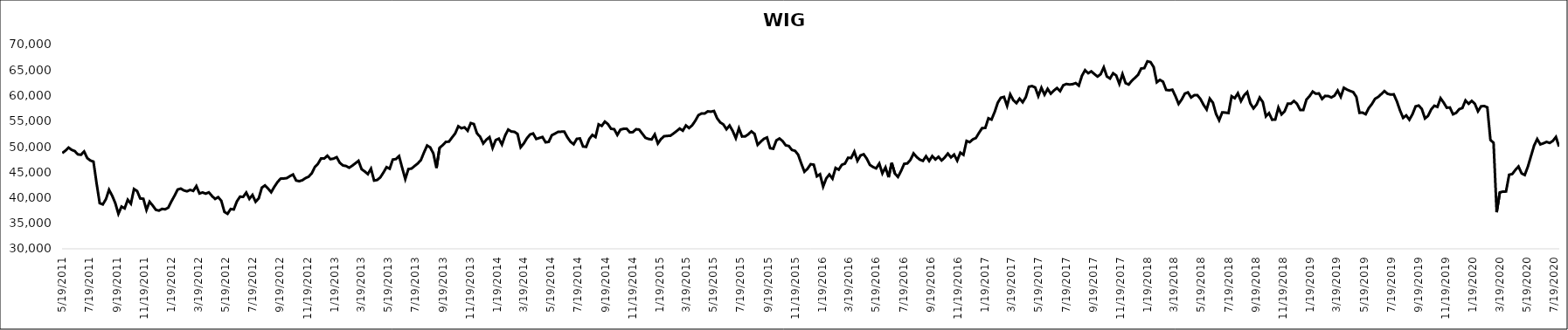
| Category | WIG |
|---|---|
| 5/19/11 | 48747.55 |
| 5/26/11 | 49215.53 |
| 6/2/11 | 49824.93 |
| 6/9/11 | 49378.82 |
| 6/16/11 | 49129.21 |
| 6/23/11 | 48485.26 |
| 6/30/11 | 48414.36 |
| 7/7/11 | 49057.05 |
| 7/14/11 | 47768.38 |
| 7/21/11 | 47291.31 |
| 7/28/11 | 47071.4 |
| 8/4/11 | 42828.22 |
| 8/11/11 | 38934.71 |
| 8/18/11 | 38697.56 |
| 8/25/11 | 39715.27 |
| 9/1/11 | 41553.09 |
| 9/8/11 | 40405.17 |
| 9/15/11 | 38945 |
| 9/22/11 | 36851.2 |
| 9/29/11 | 38264.32 |
| 10/6/11 | 37915.03 |
| 10/13/11 | 39608.13 |
| 10/20/11 | 38835.92 |
| 10/27/11 | 41708.88 |
| 11/3/11 | 41313.92 |
| 11/10/11 | 39853.18 |
| 11/17/11 | 39797.19 |
| 11/24/11 | 37607.27 |
| 12/1/11 | 39215.21 |
| 12/8/11 | 38474.28 |
| 12/15/11 | 37637.47 |
| 12/22/11 | 37478.7 |
| 12/29/11 | 37814.52 |
| 1/5/12 | 37739.39 |
| 1/12/12 | 38062.87 |
| 1/19/12 | 39288.13 |
| 1/26/12 | 40392.48 |
| 2/2/12 | 41602.24 |
| 2/9/12 | 41792.46 |
| 2/16/12 | 41430.3 |
| 2/23/12 | 41258.14 |
| 3/1/12 | 41533.87 |
| 3/8/12 | 41337.97 |
| 3/15/12 | 42281.33 |
| 3/22/12 | 40834.43 |
| 3/29/12 | 41028.06 |
| 4/5/12 | 40802.41 |
| 4/12/12 | 41053.82 |
| 4/19/12 | 40354.53 |
| 4/26/12 | 39761.78 |
| 5/3/12 | 40114.73 |
| 5/10/12 | 39404.16 |
| 5/17/12 | 37228.88 |
| 5/24/12 | 36852.75 |
| 5/31/12 | 37793.58 |
| 6/7/12 | 37707.25 |
| 6/14/12 | 39286.64 |
| 6/21/12 | 40207.61 |
| 6/28/12 | 40165.34 |
| 7/5/12 | 41013.96 |
| 7/12/12 | 39778.1 |
| 7/19/12 | 40545.64 |
| 7/26/12 | 39213.05 |
| 8/2/12 | 39876.95 |
| 8/9/12 | 41976.63 |
| 8/16/12 | 42408.41 |
| 8/23/12 | 41795.63 |
| 8/30/12 | 41077.44 |
| 9/6/12 | 42134.93 |
| 9/13/12 | 43047.41 |
| 9/20/12 | 43737.02 |
| 9/27/12 | 43763.3 |
| 10/4/12 | 43840.23 |
| 10/11/12 | 44224.67 |
| 10/18/12 | 44550.12 |
| 10/25/12 | 43374.6 |
| 11/1/12 | 43232.44 |
| 11/8/12 | 43429.42 |
| 11/15/12 | 43845.94 |
| 11/22/12 | 44121.53 |
| 11/29/12 | 44787.84 |
| 12/6/12 | 46019.97 |
| 12/13/12 | 46653.84 |
| 12/20/12 | 47701.82 |
| 12/27/12 | 47673.03 |
| 1/3/13 | 48222.72 |
| 1/10/13 | 47546.91 |
| 1/17/13 | 47661.37 |
| 1/24/13 | 47942.04 |
| 1/31/13 | 46840.15 |
| 2/7/13 | 46329.66 |
| 2/14/13 | 46211.54 |
| 2/21/13 | 45879.9 |
| 2/28/13 | 46280.36 |
| 3/7/13 | 46745.26 |
| 3/14/13 | 47223.68 |
| 3/21/13 | 45580.47 |
| 3/28/13 | 45147.57 |
| 4/4/13 | 44623.89 |
| 4/11/13 | 45688.48 |
| 4/18/13 | 43364.7 |
| 4/25/13 | 43482.18 |
| 5/2/13 | 43991.51 |
| 5/9/13 | 44943.16 |
| 5/16/13 | 45992.03 |
| 5/23/13 | 45687.76 |
| 5/30/13 | 47476.64 |
| 6/6/13 | 47573.66 |
| 6/13/13 | 48152.82 |
| 6/20/13 | 45870 |
| 6/27/13 | 43667.37 |
| 7/4/13 | 45613.75 |
| 7/11/13 | 45712.72 |
| 7/18/13 | 46221.23 |
| 7/25/13 | 46713.02 |
| 8/1/13 | 47370.81 |
| 8/8/13 | 48862.88 |
| 8/15/13 | 50223.95 |
| 8/22/13 | 49846.48 |
| 8/29/13 | 48676.45 |
| 9/5/13 | 45830.66 |
| 9/12/13 | 49771.55 |
| 9/19/13 | 50300.53 |
| 9/26/13 | 50936.34 |
| 10/3/13 | 50982.03 |
| 10/10/13 | 51806.83 |
| 10/17/13 | 52573.59 |
| 10/24/13 | 53994.46 |
| 10/31/13 | 53607.86 |
| 11/7/13 | 53785.07 |
| 11/14/13 | 53127.16 |
| 11/21/13 | 54621.21 |
| 11/28/13 | 54420.19 |
| 12/5/13 | 52597.13 |
| 12/12/13 | 51947.96 |
| 12/19/13 | 50631.75 |
| 12/26/13 | 51362.3 |
| 1/2/14 | 51865.89 |
| 1/9/14 | 49753.03 |
| 1/16/14 | 51288.7 |
| 1/23/14 | 51569.21 |
| 1/30/14 | 50417.17 |
| 2/6/14 | 52138.87 |
| 2/13/14 | 53349.65 |
| 2/20/14 | 52967.02 |
| 2/27/14 | 52906.04 |
| 3/6/14 | 52487.84 |
| 3/13/14 | 49878.65 |
| 3/20/14 | 50627.71 |
| 3/27/14 | 51642.99 |
| 4/3/14 | 52376.18 |
| 4/10/14 | 52580.73 |
| 4/17/14 | 51510.98 |
| 4/24/14 | 51705.76 |
| 5/1/14 | 51892.77 |
| 5/8/14 | 50851.25 |
| 5/15/14 | 50944.5 |
| 5/22/14 | 52244.13 |
| 5/29/14 | 52553.48 |
| 6/5/14 | 52901.29 |
| 6/12/14 | 52927.91 |
| 6/19/14 | 52937.45 |
| 6/26/14 | 51815.43 |
| 7/3/14 | 50951.73 |
| 7/10/14 | 50474.36 |
| 7/17/14 | 51527.37 |
| 7/24/14 | 51613.47 |
| 7/31/14 | 50037.12 |
| 8/7/14 | 49958.67 |
| 8/14/14 | 51512.57 |
| 8/21/14 | 52294.93 |
| 8/28/14 | 51882.01 |
| 9/4/14 | 54358.49 |
| 9/11/14 | 54065.27 |
| 9/18/14 | 54906.1 |
| 9/25/14 | 54411.77 |
| 10/2/14 | 53498.77 |
| 10/9/14 | 53416.03 |
| 10/16/14 | 52297.79 |
| 10/23/14 | 53335.43 |
| 10/30/14 | 53492 |
| 11/6/14 | 53512.14 |
| 11/13/14 | 52816.35 |
| 11/20/14 | 52848.54 |
| 11/27/14 | 53415.63 |
| 12/4/14 | 53346.86 |
| 12/11/14 | 52550.03 |
| 12/18/14 | 51739.04 |
| 12/25/14 | 51511.68 |
| 1/1/15 | 51416.08 |
| 1/8/15 | 52391 |
| 1/15/15 | 50616.63 |
| 1/22/15 | 51484.81 |
| 1/29/15 | 52040.24 |
| 2/5/15 | 52107.26 |
| 2/12/15 | 52139.81 |
| 2/19/15 | 52572.95 |
| 2/26/15 | 53042.6 |
| 3/5/15 | 53546.4 |
| 3/12/15 | 53136.13 |
| 3/19/15 | 54148.48 |
| 3/26/15 | 53649.9 |
| 4/2/15 | 54179.04 |
| 4/9/15 | 55063.85 |
| 4/16/15 | 56165.1 |
| 4/23/15 | 56492.95 |
| 4/30/15 | 56477.69 |
| 5/7/15 | 56911.34 |
| 5/14/15 | 56845.83 |
| 5/21/15 | 56990.6 |
| 5/28/15 | 55556.13 |
| 6/4/15 | 54749.74 |
| 6/11/15 | 54357.69 |
| 6/18/15 | 53408.53 |
| 6/25/15 | 54141.2 |
| 7/2/15 | 53074.71 |
| 7/9/15 | 51658.71 |
| 7/16/15 | 53588.24 |
| 7/23/15 | 51986.22 |
| 7/30/15 | 52011.81 |
| 8/6/15 | 52418.07 |
| 8/13/15 | 52995.96 |
| 8/20/15 | 52508.32 |
| 8/27/15 | 50366.09 |
| 9/3/15 | 50977.06 |
| 9/10/15 | 51527.08 |
| 9/17/15 | 51801.58 |
| 9/24/15 | 49701.31 |
| 10/1/15 | 49593.95 |
| 10/8/15 | 51222.77 |
| 10/15/15 | 51599.62 |
| 10/22/15 | 51094.29 |
| 10/29/15 | 50262.68 |
| 11/5/15 | 50125.85 |
| 11/12/15 | 49358.2 |
| 11/19/15 | 49177.74 |
| 11/26/15 | 48418.14 |
| 12/3/15 | 46693.09 |
| 12/10/15 | 45093.65 |
| 12/17/15 | 45684.05 |
| 12/24/15 | 46564.08 |
| 12/31/15 | 46467.38 |
| 1/7/16 | 44195.91 |
| 1/14/16 | 44596.08 |
| 1/21/16 | 42180.3 |
| 1/28/16 | 43778.96 |
| 2/4/16 | 44557.64 |
| 2/11/16 | 43741.96 |
| 2/18/16 | 45834.88 |
| 2/25/16 | 45497.77 |
| 3/3/16 | 46448.27 |
| 3/10/16 | 46686.74 |
| 3/17/16 | 47833.39 |
| 3/24/16 | 47778.01 |
| 3/31/16 | 49017.35 |
| 4/7/16 | 47231.36 |
| 4/14/16 | 48285.21 |
| 4/21/16 | 48514.39 |
| 4/28/16 | 47643.7 |
| 5/5/16 | 46430.16 |
| 5/12/16 | 46022.02 |
| 5/19/16 | 45751.68 |
| 5/26/16 | 46695.37 |
| 6/2/16 | 44772.72 |
| 6/9/16 | 45940.12 |
| 6/16/16 | 44007.81 |
| 6/23/16 | 46826.85 |
| 6/30/16 | 44748.53 |
| 7/7/16 | 44077.16 |
| 7/14/16 | 45246.26 |
| 7/21/16 | 46639.17 |
| 7/28/16 | 46718.98 |
| 8/4/16 | 47407.09 |
| 8/11/16 | 48675.96 |
| 8/18/16 | 47967.07 |
| 8/25/16 | 47464.07 |
| 9/1/16 | 47221.32 |
| 9/8/16 | 48129.15 |
| 9/15/16 | 47198.39 |
| 9/22/16 | 48154.88 |
| 9/29/16 | 47494.62 |
| 10/6/16 | 48014.44 |
| 10/13/16 | 47303.15 |
| 10/20/16 | 47894.17 |
| 10/27/16 | 48651.28 |
| 11/3/16 | 47899.61 |
| 11/10/16 | 48447.59 |
| 11/17/16 | 47274.21 |
| 11/24/16 | 48824.83 |
| 12/1/16 | 48404.21 |
| 12/8/16 | 51123.43 |
| 12/15/16 | 50881.35 |
| 12/22/16 | 51423.71 |
| 12/29/16 | 51703.91 |
| 1/5/17 | 52721.67 |
| 1/12/17 | 53650.94 |
| 1/19/17 | 53654.99 |
| 1/26/17 | 55560.23 |
| 2/2/17 | 55303.11 |
| 2/9/17 | 56785.52 |
| 2/16/17 | 58610.28 |
| 2/23/17 | 59583.89 |
| 3/2/17 | 59743.64 |
| 3/9/17 | 57986.6 |
| 3/16/17 | 60247.18 |
| 3/23/17 | 59093.68 |
| 3/30/17 | 58527.2 |
| 4/6/17 | 59406.36 |
| 4/13/17 | 58695.36 |
| 4/20/17 | 59700.07 |
| 4/27/17 | 61731.8 |
| 5/4/17 | 61862.8 |
| 5/11/17 | 61598.78 |
| 5/18/17 | 59901.12 |
| 5/25/17 | 61536.22 |
| 6/1/17 | 60181.96 |
| 6/8/17 | 61312.68 |
| 6/15/17 | 60381.07 |
| 6/22/17 | 60987.33 |
| 6/29/17 | 61475.96 |
| 7/6/17 | 60869.83 |
| 7/13/17 | 62018.68 |
| 7/20/17 | 62269.72 |
| 7/27/17 | 62171.7 |
| 8/3/17 | 62231.08 |
| 8/10/17 | 62451.57 |
| 8/17/17 | 61949.4 |
| 8/24/17 | 63886.54 |
| 8/31/17 | 64973.76 |
| 9/7/17 | 64381.87 |
| 9/14/17 | 64748.47 |
| 9/21/17 | 64209.19 |
| 9/28/17 | 63729.77 |
| 10/5/17 | 64185.71 |
| 10/12/17 | 65529.1 |
| 10/19/17 | 63745 |
| 10/26/17 | 63342.71 |
| 11/2/17 | 64375.83 |
| 11/9/17 | 63923.62 |
| 11/16/17 | 62299.29 |
| 11/23/17 | 64207.77 |
| 11/30/17 | 62440.31 |
| 12/7/17 | 62164.65 |
| 12/14/17 | 62916.39 |
| 12/21/17 | 63477.25 |
| 12/28/17 | 64053.47 |
| 1/4/18 | 65297.96 |
| 1/11/18 | 65379.88 |
| 1/18/18 | 66709.12 |
| 1/25/18 | 66561.79 |
| 2/1/18 | 65585.79 |
| 2/8/18 | 62604.89 |
| 2/15/18 | 63078.16 |
| 2/22/18 | 62717.27 |
| 3/1/18 | 61116.96 |
| 3/8/18 | 61036.99 |
| 3/15/18 | 61156.91 |
| 3/22/18 | 59862.55 |
| 3/29/18 | 58377.42 |
| 4/5/18 | 59244.04 |
| 4/12/18 | 60393.23 |
| 4/19/18 | 60629.81 |
| 4/26/18 | 59628.04 |
| 5/3/18 | 60066.46 |
| 5/10/18 | 60091.26 |
| 5/17/18 | 59337.27 |
| 5/24/18 | 58189.49 |
| 5/31/18 | 57282.73 |
| 6/7/18 | 59412.76 |
| 6/14/18 | 58603.93 |
| 6/21/18 | 56425.25 |
| 6/28/18 | 55169.77 |
| 7/5/18 | 56719.88 |
| 7/12/18 | 56671.44 |
| 7/19/18 | 56585.5 |
| 7/26/18 | 59871.2 |
| 8/2/18 | 59484.35 |
| 8/9/18 | 60455.75 |
| 8/16/18 | 58921.44 |
| 8/23/18 | 60044.45 |
| 8/30/18 | 60690.32 |
| 9/6/18 | 58469.6 |
| 9/13/18 | 57493.38 |
| 9/20/18 | 58231.57 |
| 9/27/18 | 59616.27 |
| 10/4/18 | 58736.08 |
| 10/11/18 | 55941.06 |
| 10/18/18 | 56560.93 |
| 10/25/18 | 55271.63 |
| 11/1/18 | 55312.71 |
| 11/8/18 | 57655.73 |
| 11/15/18 | 56329.01 |
| 11/22/18 | 56932.62 |
| 11/29/18 | 58412.94 |
| 12/6/18 | 58409.09 |
| 12/13/18 | 58952.55 |
| 12/20/18 | 58349.03 |
| 12/27/18 | 57183.28 |
| 1/3/19 | 57192.42 |
| 1/10/19 | 59219.23 |
| 1/17/19 | 59894.9 |
| 1/24/19 | 60791.02 |
| 1/31/19 | 60367.42 |
| 2/7/19 | 60422.38 |
| 2/14/19 | 59348.4 |
| 2/21/19 | 59938.07 |
| 2/28/19 | 59903.7 |
| 3/7/19 | 59638.3 |
| 3/14/19 | 60002.72 |
| 3/21/19 | 60976.51 |
| 3/28/19 | 59752.66 |
| 4/4/19 | 61533.27 |
| 4/11/19 | 61168.92 |
| 4/18/19 | 60910.11 |
| 4/25/19 | 60680.62 |
| 5/2/19 | 59744.3 |
| 5/9/19 | 56637.25 |
| 5/16/19 | 56664.5 |
| 5/23/19 | 56351.13 |
| 5/30/19 | 57566.83 |
| 6/6/19 | 58360.5 |
| 6/13/19 | 59374.38 |
| 6/20/19 | 59738.56 |
| 6/27/19 | 60293.37 |
| 7/4/19 | 60888.98 |
| 7/11/19 | 60362.11 |
| 7/18/19 | 60192.6 |
| 7/25/19 | 60249.72 |
| 8/1/19 | 58863.73 |
| 8/8/19 | 57102.69 |
| 8/15/19 | 55634.7 |
| 8/22/19 | 56118.92 |
| 8/29/19 | 55273.05 |
| 9/5/19 | 56358.3 |
| 9/12/19 | 57886.6 |
| 9/19/19 | 58053.03 |
| 9/26/19 | 57377.87 |
| 10/3/19 | 55523.06 |
| 10/10/19 | 56034.97 |
| 10/17/19 | 57297.12 |
| 10/24/19 | 58012.97 |
| 10/31/19 | 57783.02 |
| 11/7/19 | 59492.22 |
| 11/14/19 | 58622.1 |
| 11/21/19 | 57618.54 |
| 11/28/19 | 57669.94 |
| 12/5/19 | 56338.75 |
| 12/12/19 | 56621.06 |
| 12/19/19 | 57346.95 |
| 12/26/19 | 57569.71 |
| 1/2/20 | 59048.28 |
| 1/9/20 | 58397.17 |
| 1/16/20 | 58962.37 |
| 1/23/20 | 58401.85 |
| 1/30/20 | 56923.36 |
| 2/6/20 | 57900.04 |
| 2/13/20 | 57960.23 |
| 2/20/20 | 57693.12 |
| 2/27/20 | 51318.69 |
| 3/5/20 | 50753.91 |
| 3/12/20 | 37164.02 |
| 3/19/20 | 41041.92 |
| 3/26/20 | 41202.98 |
| 4/2/20 | 41219.51 |
| 4/9/20 | 44499.23 |
| 4/16/20 | 44645.12 |
| 4/23/20 | 45450.43 |
| 4/30/20 | 46117 |
| 5/7/20 | 44769.05 |
| 5/14/20 | 44450.71 |
| 5/21/20 | 46073.39 |
| 5/28/20 | 48144.34 |
| 6/4/20 | 50202.54 |
| 6/11/20 | 51486.94 |
| 6/18/20 | 50445.13 |
| 6/25/20 | 50658.89 |
| 7/2/20 | 50937.18 |
| 7/9/20 | 50726.22 |
| 7/16/20 | 51121.23 |
| 7/23/20 | 51890.42 |
| 7/30/20 | 50024.63 |